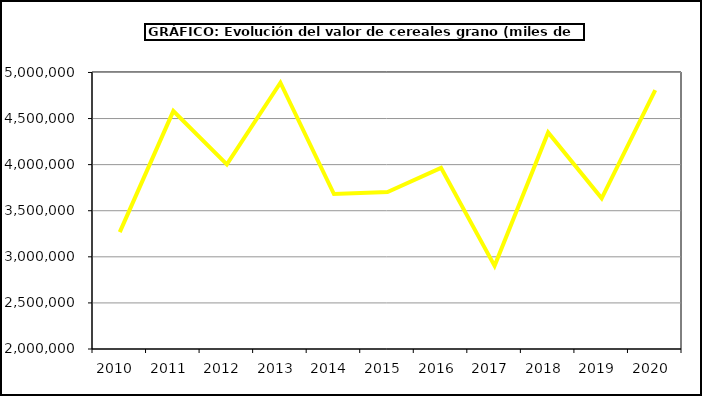
| Category | Valor |
|---|---|
| 2010.0 | 3268396.026 |
| 2011.0 | 4580902.717 |
| 2012.0 | 4003467.41 |
| 2013.0 | 4888762 |
| 2014.0 | 3681432.099 |
| 2015.0 | 3702937 |
| 2016.0 | 3964711.334 |
| 2017.0 | 2902062.238 |
| 2018.0 | 4348687.067 |
| 2019.0 | 3634175.91 |
| 2020.0 | 4808167.865 |